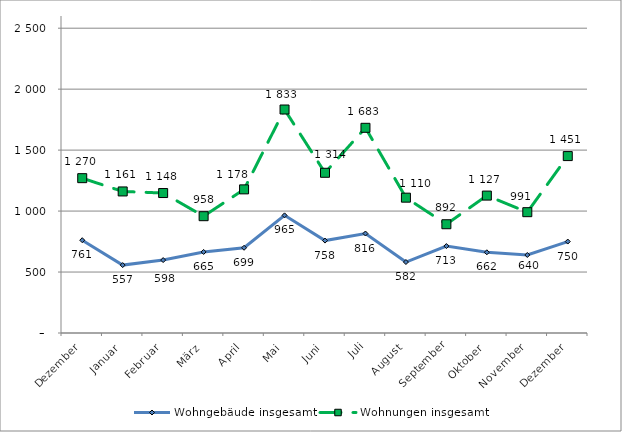
| Category | Wohngebäude insgesamt | Wohnungen insgesamt |
|---|---|---|
| Dezember | 761 | 1270 |
| Januar | 557 | 1161 |
| Februar | 598 | 1148 |
| März | 665 | 958 |
| April | 699 | 1178 |
| Mai | 965 | 1833 |
| Juni | 758 | 1314 |
| Juli | 816 | 1683 |
| August | 582 | 1110 |
| September | 713 | 892 |
| Oktober | 662 | 1127 |
| November | 640 | 991 |
| Dezember | 750 | 1451 |